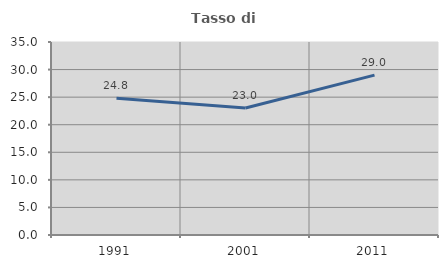
| Category | Tasso di occupazione   |
|---|---|
| 1991.0 | 24.788 |
| 2001.0 | 23.027 |
| 2011.0 | 28.999 |